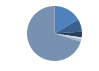
| Category | Series 0 |
|---|---|
| ARRASTRE | 117 |
| CERCO | 52 |
| PALANGRE | 24 |
| REDES DE ENMALLE | 8 |
| ARTES FIJAS | 10 |
| ARTES MENORES | 496 |